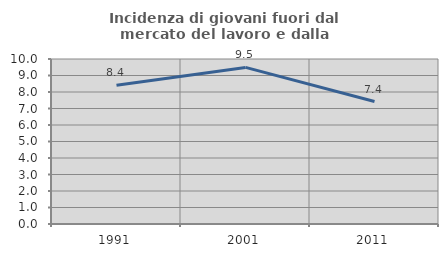
| Category | Incidenza di giovani fuori dal mercato del lavoro e dalla formazione  |
|---|---|
| 1991.0 | 8.415 |
| 2001.0 | 9.492 |
| 2011.0 | 7.421 |